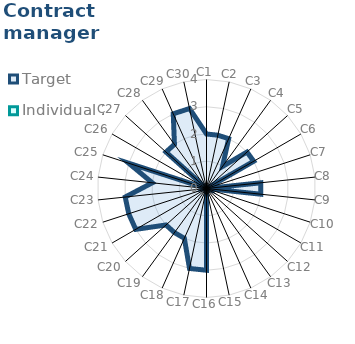
| Category | Target | Individual 2 |
|---|---|---|
| C1 | 2 | 0 |
| C2 | 2 | 0 |
| C3 | 2 | 0 |
| C4 | 1 | 0 |
| C5 | 2 | 0 |
| C6 | 2 | 0 |
| C7 | 0 | 0 |
| C8 | 2 | 0 |
| C9 | 2 | 0 |
| C10 | 0 | 0 |
| C11 | 0 | 0 |
| C12 | 0 | 0 |
| C13 | 0 | 0 |
| C14 | 0 | 0 |
| C15 | 0 | 0 |
| C16 | 3 | 0 |
| C17 | 3 | 0 |
| C18 | 2 | 0 |
| C19 | 2 | 0 |
| C20 | 2 | 0 |
| C21 | 3 | 0 |
| C22 | 3 | 0 |
| C23 | 3 | 0 |
| C24 | 2 | 0 |
| C25 | 3 | 0 |
| C26 | 0 | 0 |
| C27 | 2 | 0 |
| C28 | 2 | 0 |
| C29 | 3 | 0 |
| C30 | 3 | 0 |